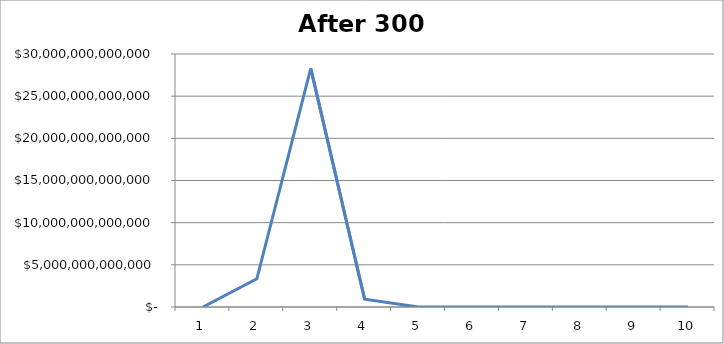
| Category | Series 0 |
|---|---|
| 0 | 1402065289.858 |
| 1 | 3341026195015.524 |
| 2 | 28297693110817.945 |
| 3 | 920933736515.878 |
| 4 | 65536000 |
| 5 | 2.362 |
| 6 | 0 |
| 7 | 0 |
| 8 | 0 |
| 9 | 0 |